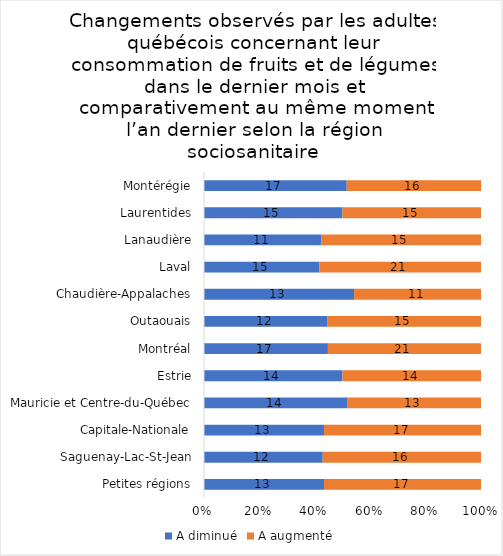
| Category | A diminué | A augmenté |
|---|---|---|
| Petites régions | 13 | 17 |
| Saguenay-Lac-St-Jean | 12 | 16 |
| Capitale-Nationale | 13 | 17 |
| Mauricie et Centre-du-Québec | 14 | 13 |
| Estrie | 14 | 14 |
| Montréal | 17 | 21 |
| Outaouais | 12 | 15 |
| Chaudière-Appalaches | 13 | 11 |
| Laval | 15 | 21 |
| Lanaudière | 11 | 15 |
| Laurentides | 15 | 15 |
| Montérégie | 17 | 16 |